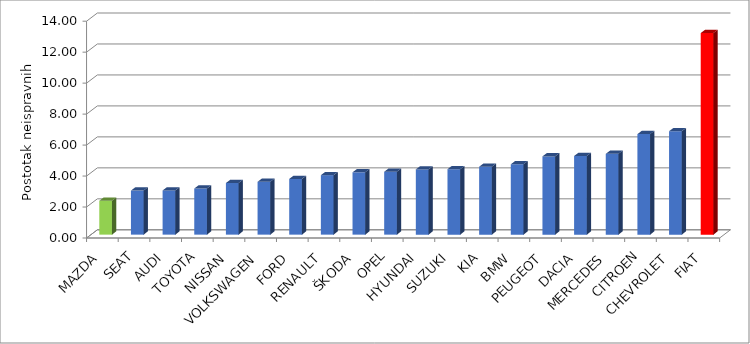
| Category | Series 4 |
|---|---|
| MAZDA | 2.187 |
| SEAT | 2.845 |
| AUDI | 2.853 |
| TOYOTA | 2.978 |
| NISSAN | 3.333 |
| VOLKSWAGEN | 3.413 |
| FORD | 3.597 |
| RENAULT | 3.84 |
| ŠKODA | 4.025 |
| OPEL | 4.061 |
| HYUNDAI | 4.212 |
| SUZUKI | 4.226 |
| KIA | 4.386 |
| BMW | 4.543 |
| PEUGEOT | 5.053 |
| DACIA | 5.077 |
| MERCEDES | 5.218 |
| CITROEN | 6.491 |
| CHEVROLET | 6.678 |
| FIAT | 13.016 |